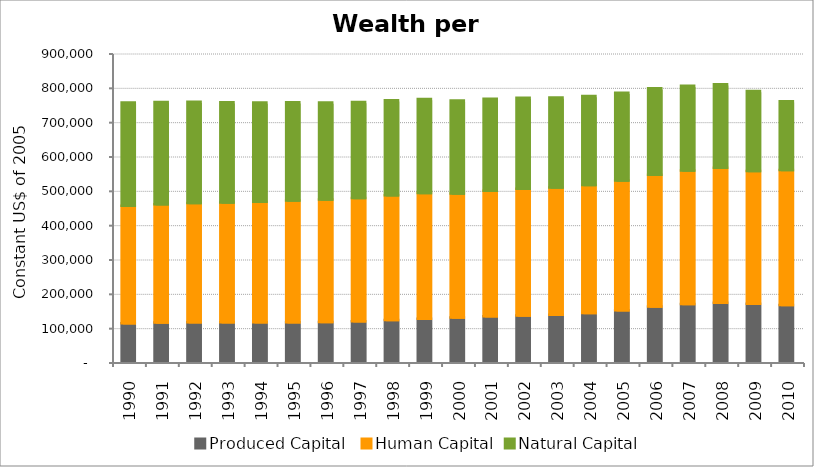
| Category | Produced Capital  | Human Capital | Natural Capital |
|---|---|---|---|
| 1990.0 | 112463.085 | 342039.547 | 300729.03 |
| 1991.0 | 114132.458 | 344836.672 | 297730.065 |
| 1992.0 | 114935.125 | 347546.937 | 294840.223 |
| 1993.0 | 115029.748 | 348792.028 | 291871.265 |
| 1994.0 | 115055.566 | 351279.211 | 289090.947 |
| 1995.0 | 114920.369 | 354991.544 | 286163.182 |
| 1996.0 | 116088.199 | 356184.991 | 283066.422 |
| 1997.0 | 117737.021 | 358842.311 | 279951.627 |
| 1998.0 | 121737.512 | 363393.755 | 276550.567 |
| 1999.0 | 125043.168 | 366751.683 | 273484.165 |
| 2000.0 | 129192.07 | 360753.909 | 270753.786 |
| 2001.0 | 132615.733 | 365484.529 | 268101.242 |
| 2002.0 | 134426.272 | 369624.974 | 265210.793 |
| 2003.0 | 136924.769 | 370744.12 | 262240.221 |
| 2004.0 | 141667.144 | 372981.704 | 259166.848 |
| 2005.0 | 149806.546 | 377793.313 | 255629.492 |
| 2006.0 | 160805.295 | 383911.025 | 251871.95 |
| 2007.0 | 168444.235 | 388410.719 | 247331.703 |
| 2008.0 | 172080.902 | 392732.104 | 243394.859 |
| 2009.0 | 168881.719 | 386894.791 | 232992.025 |
| 2010.0 | 165456.827 | 392854.333 | 200319.514 |